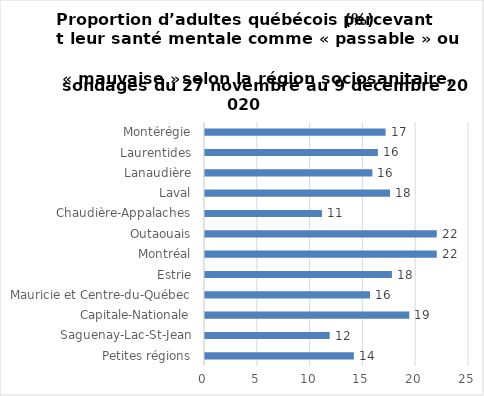
| Category | % |
|---|---|
| Petites régions | 14.099 |
| Saguenay-Lac-St-Jean | 11.812 |
| Capitale-Nationale | 19.345 |
| Mauricie et Centre-du-Québec | 15.625 |
| Estrie | 17.704 |
| Montréal | 21.944 |
| Outaouais | 21.946 |
| Chaudière-Appalaches | 11.073 |
| Laval | 17.521 |
| Lanaudière | 15.849 |
| Laurentides | 16.37 |
| Montérégie | 17.104 |